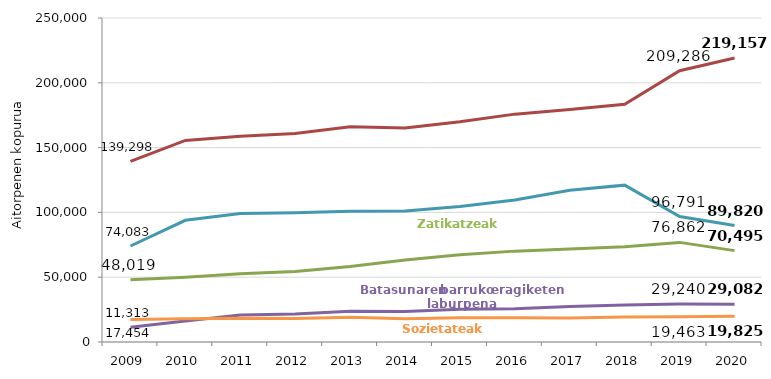
| Category | BEZ | Zatikatzeak | Batasunaren barruko eragiketen laburpena | Informazioa | Sozietateak |
|---|---|---|---|---|---|
| 2009.0 | 139298 | 48019 | 11313 | 74083 | 17454 |
| 2010.0 | 155555 | 49976 | 16241 | 93924 | 17852 |
| 2011.0 | 158799 | 52600 | 20904 | 99132 | 18416 |
| 2012.0 | 160883 | 54438 | 21534 | 99711 | 18042 |
| 2013.0 | 166124 | 58345 | 23760 | 100895 | 19090 |
| 2014.0 | 165166 | 63305 | 23561 | 101111 | 18005 |
| 2015.0 | 169888 | 67411 | 25186 | 104491 | 18631 |
| 2016.0 | 175821 | 70118 | 25707 | 109620 | 18652 |
| 2017.0 | 179378 | 71775 | 27402 | 117016 | 18540 |
| 2018.0 | 183376 | 73500 | 28599 | 121020 | 19260 |
| 2019.0 | 209286 | 76862 | 29240 | 96791 | 19463 |
| 2020.0 | 219157 | 70495 | 29082 | 89820 | 19825 |